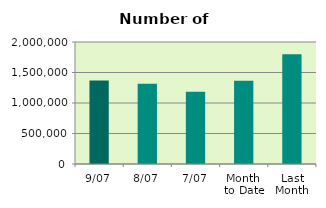
| Category | Series 0 |
|---|---|
| 9/07 | 1367612 |
| 8/07 | 1316950 |
| 7/07 | 1186102 |
| Month 
to Date | 1363474.571 |
| Last
Month | 1799892.818 |